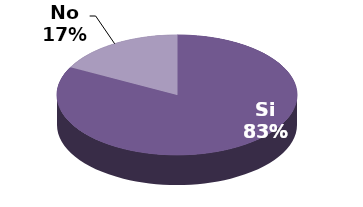
| Category | Series 1 |
|---|---|
| Si | 19 |
| No | 4 |